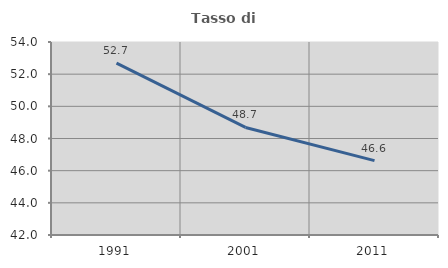
| Category | Tasso di occupazione   |
|---|---|
| 1991.0 | 52.689 |
| 2001.0 | 48.687 |
| 2011.0 | 46.622 |